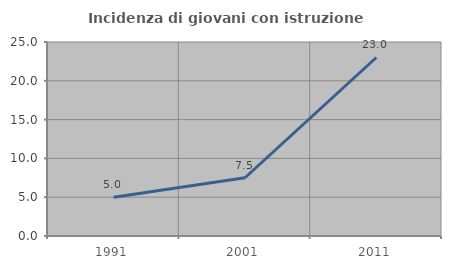
| Category | Incidenza di giovani con istruzione universitaria |
|---|---|
| 1991.0 | 5 |
| 2001.0 | 7.509 |
| 2011.0 | 23.005 |